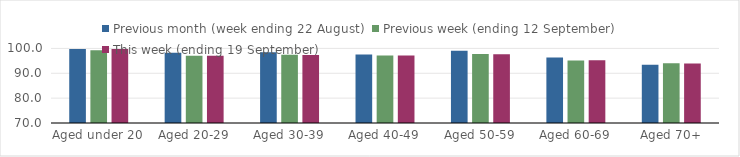
| Category | Previous month (week ending 22 August) | Previous week (ending 12 September) | This week (ending 19 September) |
|---|---|---|---|
| Aged under 20 | 99.72 | 99.24 | 99.77 |
| Aged 20-29 | 98.3 | 97.05 | 97.05 |
| Aged 30-39 | 98.44 | 97.49 | 97.35 |
| Aged 40-49 | 97.51 | 97.19 | 97.17 |
| Aged 50-59 | 99.04 | 97.76 | 97.68 |
| Aged 60-69 | 96.38 | 95.1 | 95.2 |
| Aged 70+ | 93.44 | 94.08 | 93.96 |